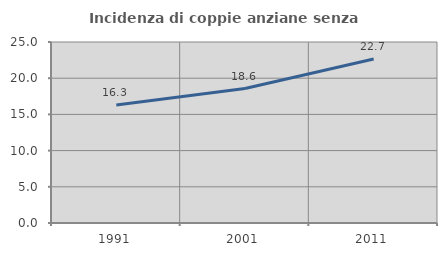
| Category | Incidenza di coppie anziane senza figli  |
|---|---|
| 1991.0 | 16.29 |
| 2001.0 | 18.571 |
| 2011.0 | 22.652 |